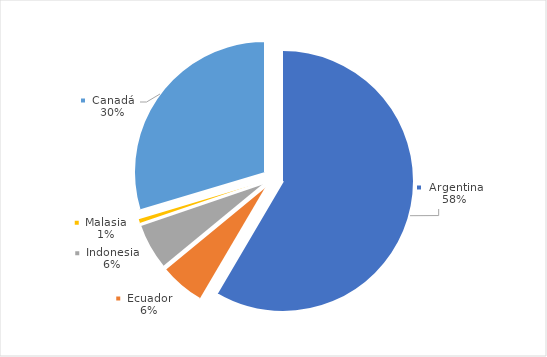
| Category | Series 0 |
|---|---|
| Argentina | 1208.665 |
| Ecuador | 115.081 |
| Indonesia | 118.587 |
| Malasia | 12.369 |
| Canadá | 612.593 |